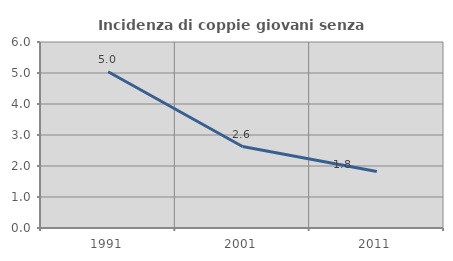
| Category | Incidenza di coppie giovani senza figli |
|---|---|
| 1991.0 | 5.038 |
| 2001.0 | 2.629 |
| 2011.0 | 1.826 |